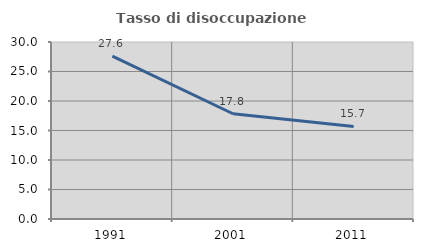
| Category | Tasso di disoccupazione giovanile  |
|---|---|
| 1991.0 | 27.619 |
| 2001.0 | 17.84 |
| 2011.0 | 15.686 |